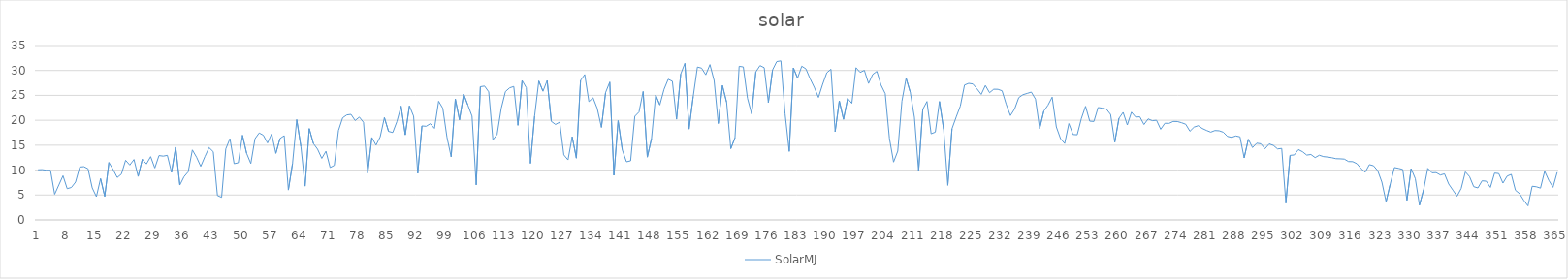
| Category | SolarMJ |
|---|---|
| 0 | 10.061 |
| 1 | 10.091 |
| 2 | 9.966 |
| 3 | 9.96 |
| 4 | 5.145 |
| 5 | 7.008 |
| 6 | 8.867 |
| 7 | 6.27 |
| 8 | 6.511 |
| 9 | 7.591 |
| 10 | 10.609 |
| 11 | 10.687 |
| 12 | 10.26 |
| 13 | 6.431 |
| 14 | 4.667 |
| 15 | 8.287 |
| 16 | 4.73 |
| 17 | 11.534 |
| 18 | 10.111 |
| 19 | 8.513 |
| 20 | 9.208 |
| 21 | 11.975 |
| 22 | 11.017 |
| 23 | 12.126 |
| 24 | 8.729 |
| 25 | 12.177 |
| 26 | 11.242 |
| 27 | 12.697 |
| 28 | 10.421 |
| 29 | 12.917 |
| 30 | 12.798 |
| 31 | 12.96 |
| 32 | 9.553 |
| 33 | 14.595 |
| 34 | 6.996 |
| 35 | 8.667 |
| 36 | 9.662 |
| 37 | 14.043 |
| 38 | 12.583 |
| 39 | 10.745 |
| 40 | 12.707 |
| 41 | 14.518 |
| 42 | 13.692 |
| 43 | 4.893 |
| 44 | 4.526 |
| 45 | 14.242 |
| 46 | 16.318 |
| 47 | 11.284 |
| 48 | 11.475 |
| 49 | 16.994 |
| 50 | 13.355 |
| 51 | 11.317 |
| 52 | 16.295 |
| 53 | 17.457 |
| 54 | 16.993 |
| 55 | 15.44 |
| 56 | 17.277 |
| 57 | 13.359 |
| 58 | 16.348 |
| 59 | 16.902 |
| 60 | 6.007 |
| 61 | 11.336 |
| 62 | 20.131 |
| 63 | 14.735 |
| 64 | 6.784 |
| 65 | 18.324 |
| 66 | 15.325 |
| 67 | 14.188 |
| 68 | 12.352 |
| 69 | 13.782 |
| 70 | 10.512 |
| 71 | 10.951 |
| 72 | 17.951 |
| 73 | 20.489 |
| 74 | 21.074 |
| 75 | 21.187 |
| 76 | 19.949 |
| 77 | 20.636 |
| 78 | 19.589 |
| 79 | 9.409 |
| 80 | 16.538 |
| 81 | 15.001 |
| 82 | 16.689 |
| 83 | 20.535 |
| 84 | 17.766 |
| 85 | 17.545 |
| 86 | 19.736 |
| 87 | 22.843 |
| 88 | 17.086 |
| 89 | 22.886 |
| 90 | 20.826 |
| 91 | 9.355 |
| 92 | 18.868 |
| 93 | 18.792 |
| 94 | 19.313 |
| 95 | 18.381 |
| 96 | 23.828 |
| 97 | 22.399 |
| 98 | 16.557 |
| 99 | 12.667 |
| 100 | 24.266 |
| 101 | 20.081 |
| 102 | 25.268 |
| 103 | 23.053 |
| 104 | 20.824 |
| 105 | 7.026 |
| 106 | 26.737 |
| 107 | 26.867 |
| 108 | 25.706 |
| 109 | 16.087 |
| 110 | 17.141 |
| 111 | 22.406 |
| 112 | 25.76 |
| 113 | 26.504 |
| 114 | 26.786 |
| 115 | 18.992 |
| 116 | 27.979 |
| 117 | 26.545 |
| 118 | 11.353 |
| 119 | 20.862 |
| 120 | 27.888 |
| 121 | 25.832 |
| 122 | 27.982 |
| 123 | 19.78 |
| 124 | 19.156 |
| 125 | 19.632 |
| 126 | 13.05 |
| 127 | 12.049 |
| 128 | 16.683 |
| 129 | 12.409 |
| 130 | 27.986 |
| 131 | 29.184 |
| 132 | 23.746 |
| 133 | 24.507 |
| 134 | 22.368 |
| 135 | 18.581 |
| 136 | 25.578 |
| 137 | 27.674 |
| 138 | 8.962 |
| 139 | 19.916 |
| 140 | 14.065 |
| 141 | 11.667 |
| 142 | 11.864 |
| 143 | 20.802 |
| 144 | 21.662 |
| 145 | 25.773 |
| 146 | 12.61 |
| 147 | 16.305 |
| 148 | 25.067 |
| 149 | 23.086 |
| 150 | 26.208 |
| 151 | 28.236 |
| 152 | 27.83 |
| 153 | 20.21 |
| 154 | 29.298 |
| 155 | 31.427 |
| 156 | 18.253 |
| 157 | 24.813 |
| 158 | 30.684 |
| 159 | 30.467 |
| 160 | 29.131 |
| 161 | 31.179 |
| 162 | 27.996 |
| 163 | 19.359 |
| 164 | 26.974 |
| 165 | 23.6 |
| 166 | 14.302 |
| 167 | 16.484 |
| 168 | 30.835 |
| 169 | 30.705 |
| 170 | 24.402 |
| 171 | 21.286 |
| 172 | 29.721 |
| 173 | 30.972 |
| 174 | 30.564 |
| 175 | 23.573 |
| 176 | 30.109 |
| 177 | 31.782 |
| 178 | 31.926 |
| 179 | 21.345 |
| 180 | 13.753 |
| 181 | 30.498 |
| 182 | 28.475 |
| 183 | 30.854 |
| 184 | 30.313 |
| 185 | 28.336 |
| 186 | 26.622 |
| 187 | 24.591 |
| 188 | 27.209 |
| 189 | 29.547 |
| 190 | 30.249 |
| 191 | 17.715 |
| 192 | 23.898 |
| 193 | 20.191 |
| 194 | 24.389 |
| 195 | 23.412 |
| 196 | 30.557 |
| 197 | 29.616 |
| 198 | 30.026 |
| 199 | 27.392 |
| 200 | 29.21 |
| 201 | 29.822 |
| 202 | 27.058 |
| 203 | 25.357 |
| 204 | 16.393 |
| 205 | 11.617 |
| 206 | 13.802 |
| 207 | 23.84 |
| 208 | 28.447 |
| 209 | 25.626 |
| 210 | 20.597 |
| 211 | 9.787 |
| 212 | 22.193 |
| 213 | 23.78 |
| 214 | 17.288 |
| 215 | 17.626 |
| 216 | 23.774 |
| 217 | 18.176 |
| 218 | 6.948 |
| 219 | 18.311 |
| 220 | 20.638 |
| 221 | 22.869 |
| 222 | 27.074 |
| 223 | 27.415 |
| 224 | 27.287 |
| 225 | 26.306 |
| 226 | 25.196 |
| 227 | 26.983 |
| 228 | 25.536 |
| 229 | 26.231 |
| 230 | 26.214 |
| 231 | 25.917 |
| 232 | 23.178 |
| 233 | 20.948 |
| 234 | 22.266 |
| 235 | 24.556 |
| 236 | 25.134 |
| 237 | 25.393 |
| 238 | 25.659 |
| 239 | 24.253 |
| 240 | 18.35 |
| 241 | 21.837 |
| 242 | 23.041 |
| 243 | 24.649 |
| 244 | 18.665 |
| 245 | 16.317 |
| 246 | 15.336 |
| 247 | 19.34 |
| 248 | 17.145 |
| 249 | 17.087 |
| 250 | 20.362 |
| 251 | 22.812 |
| 252 | 19.825 |
| 253 | 19.763 |
| 254 | 22.564 |
| 255 | 22.432 |
| 256 | 22.234 |
| 257 | 21.178 |
| 258 | 15.607 |
| 259 | 20.396 |
| 260 | 21.591 |
| 261 | 19.061 |
| 262 | 21.628 |
| 263 | 20.636 |
| 264 | 20.703 |
| 265 | 19.146 |
| 266 | 20.272 |
| 267 | 19.919 |
| 268 | 20.005 |
| 269 | 18.196 |
| 270 | 19.403 |
| 271 | 19.375 |
| 272 | 19.765 |
| 273 | 19.747 |
| 274 | 19.511 |
| 275 | 19.202 |
| 276 | 17.805 |
| 277 | 18.629 |
| 278 | 18.915 |
| 279 | 18.347 |
| 280 | 17.959 |
| 281 | 17.62 |
| 282 | 17.944 |
| 283 | 17.894 |
| 284 | 17.605 |
| 285 | 16.763 |
| 286 | 16.568 |
| 287 | 16.857 |
| 288 | 16.676 |
| 289 | 12.455 |
| 290 | 16.191 |
| 291 | 14.511 |
| 292 | 15.399 |
| 293 | 15.282 |
| 294 | 14.285 |
| 295 | 15.258 |
| 296 | 14.965 |
| 297 | 14.246 |
| 298 | 14.349 |
| 299 | 3.374 |
| 300 | 12.956 |
| 301 | 13.039 |
| 302 | 14.113 |
| 303 | 13.676 |
| 304 | 13.008 |
| 305 | 13.133 |
| 306 | 12.507 |
| 307 | 12.984 |
| 308 | 12.704 |
| 309 | 12.619 |
| 310 | 12.485 |
| 311 | 12.29 |
| 312 | 12.265 |
| 313 | 12.21 |
| 314 | 11.721 |
| 315 | 11.698 |
| 316 | 11.292 |
| 317 | 10.308 |
| 318 | 9.564 |
| 319 | 11.098 |
| 320 | 10.869 |
| 321 | 9.885 |
| 322 | 7.58 |
| 323 | 3.645 |
| 324 | 7.202 |
| 325 | 10.51 |
| 326 | 10.343 |
| 327 | 10.124 |
| 328 | 3.93 |
| 329 | 10.286 |
| 330 | 8.29 |
| 331 | 2.961 |
| 332 | 6.072 |
| 333 | 10.355 |
| 334 | 9.453 |
| 335 | 9.497 |
| 336 | 9.011 |
| 337 | 9.247 |
| 338 | 7.203 |
| 339 | 5.987 |
| 340 | 4.759 |
| 341 | 6.309 |
| 342 | 9.644 |
| 343 | 8.69 |
| 344 | 6.67 |
| 345 | 6.422 |
| 346 | 7.847 |
| 347 | 7.766 |
| 348 | 6.532 |
| 349 | 9.397 |
| 350 | 9.303 |
| 351 | 7.384 |
| 352 | 8.789 |
| 353 | 9.149 |
| 354 | 5.94 |
| 355 | 5.26 |
| 356 | 3.938 |
| 357 | 2.811 |
| 358 | 6.756 |
| 359 | 6.653 |
| 360 | 6.384 |
| 361 | 9.768 |
| 362 | 7.921 |
| 363 | 6.542 |
| 364 | 9.567 |